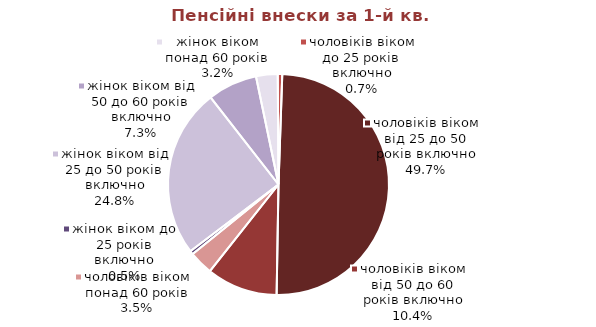
| Category | Series 0 |
|---|---|
| жінок віком до 25 років включно | 0.156 |
| жінок віком від 25 до 50 років включно | 7.462 |
| жінок віком від 50 до 60 років включно | 2.189 |
| жінок віком понад 60 років | 0.952 |
| чоловіків віком до 25 років включно | 0.198 |
| чоловіків віком від 25 до 50 років включно | 14.975 |
| чоловіків віком від 50 до 60 років включно | 3.126 |
| чоловіків віком понад 60 років | 1.059 |